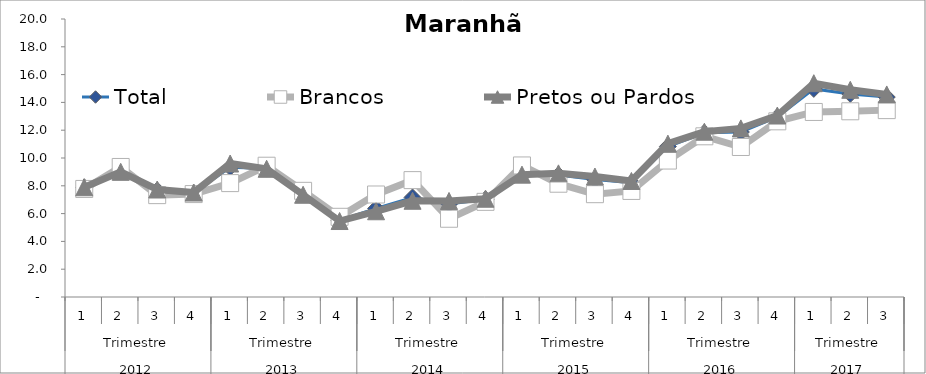
| Category | Total | Brancos | Pretos ou Pardos |
|---|---|---|---|
| 0 | 7.892 | 7.773 | 7.896 |
| 1 | 9.069 | 9.354 | 9.004 |
| 2 | 7.663 | 7.328 | 7.734 |
| 3 | 7.501 | 7.403 | 7.515 |
| 4 | 9.342 | 8.194 | 9.603 |
| 5 | 9.243 | 9.444 | 9.223 |
| 6 | 7.395 | 7.638 | 7.356 |
| 7 | 5.504 | 5.77 | 5.466 |
| 8 | 6.367 | 7.374 | 6.168 |
| 9 | 7.162 | 8.408 | 6.923 |
| 10 | 6.689 | 5.629 | 6.91 |
| 11 | 7.029 | 6.845 | 7.068 |
| 12 | 8.915 | 9.464 | 8.802 |
| 13 | 8.775 | 8.149 | 8.895 |
| 14 | 8.449 | 7.398 | 8.666 |
| 15 | 8.217 | 7.631 | 8.347 |
| 16 | 10.828 | 9.816 | 11.032 |
| 17 | 11.814 | 11.561 | 11.89 |
| 18 | 11.868 | 10.792 | 12.129 |
| 19 | 12.953 | 12.638 | 13.056 |
| 20 | 14.971 | 13.313 | 15.38 |
| 21 | 14.609 | 13.36 | 14.907 |
| 22 | 14.385 | 13.444 | 14.573 |